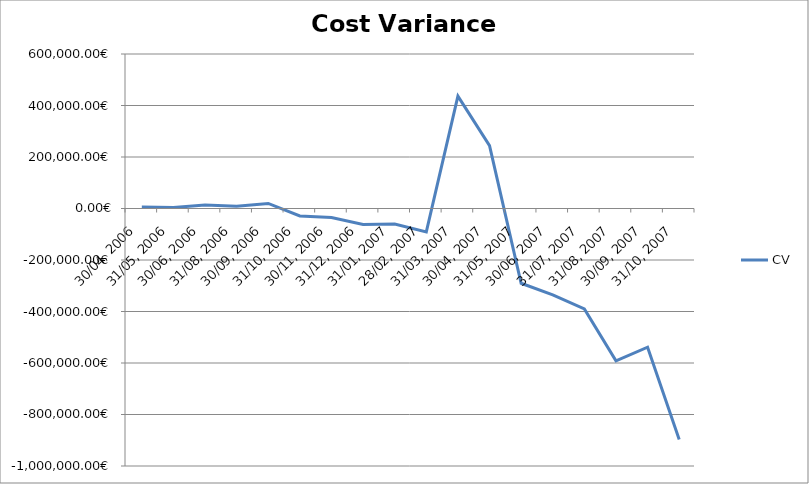
| Category | CV |
|---|---|
| 30/04, 2006 | 5632.4 |
| 31/05, 2006 | 3697.294 |
| 30/06, 2006 | 13450.116 |
| 31/08, 2006 | 8391.9 |
| 30/09, 2006 | 19726.403 |
| 31/10, 2006 | -29197.103 |
| 30/11, 2006 | -35139.714 |
| 31/12, 2006 | -61691.393 |
| 31/01, 2007 | -60235.657 |
| 28/02, 2007 | -91012.2 |
| 31/03, 2007 | 436188.606 |
| 30/04, 2007 | 243945.791 |
| 31/05, 2007 | -290372.605 |
| 30/06, 2007 | -335376.88 |
| 31/07, 2007 | -389773.24 |
| 31/08, 2007 | -591513.815 |
| 30/09, 2007 | -538681.474 |
| 31/10, 2007 | -897161.308 |